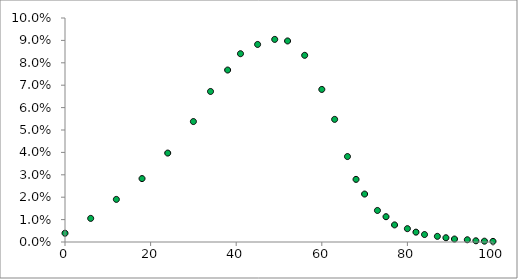
| Category | Series 0 |
|---|---|
| 0.0 | 0.004 |
| 6.0 | 0.011 |
| 12.0 | 0.019 |
| 18.0 | 0.028 |
| 24.0 | 0.04 |
| 30.0 | 0.054 |
| 34.0 | 0.067 |
| 38.0 | 0.077 |
| 41.0 | 0.084 |
| 45.0 | 0.088 |
| 49.0 | 0.09 |
| 52.0 | 0.09 |
| 56.0 | 0.083 |
| 60.0 | 0.068 |
| 63.0 | 0.055 |
| 66.0 | 0.038 |
| 68.0 | 0.028 |
| 70.0 | 0.021 |
| 73.0 | 0.014 |
| 75.0 | 0.011 |
| 77.0 | 0.008 |
| 80.0 | 0.006 |
| 82.0 | 0.004 |
| 84.0 | 0.003 |
| 87.0 | 0.003 |
| 89.0 | 0.002 |
| 91.0 | 0.001 |
| 94.0 | 0.001 |
| 96.0 | 0.001 |
| 98.0 | 0 |
| 100.0 | 0 |